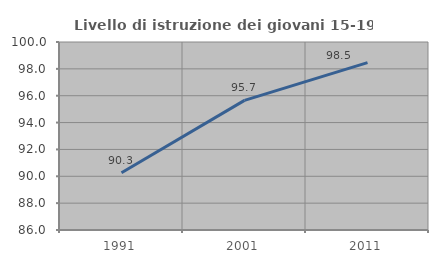
| Category | Livello di istruzione dei giovani 15-19 anni |
|---|---|
| 1991.0 | 90.265 |
| 2001.0 | 95.652 |
| 2011.0 | 98.462 |